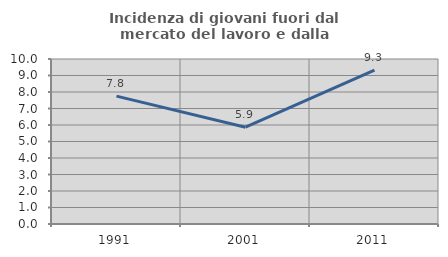
| Category | Incidenza di giovani fuori dal mercato del lavoro e dalla formazione  |
|---|---|
| 1991.0 | 7.751 |
| 2001.0 | 5.864 |
| 2011.0 | 9.324 |